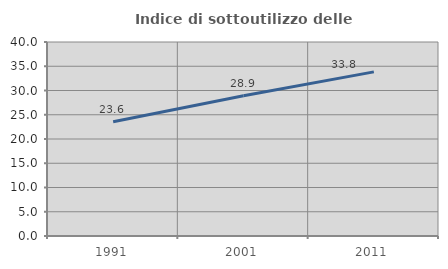
| Category | Indice di sottoutilizzo delle abitazioni  |
|---|---|
| 1991.0 | 23.573 |
| 2001.0 | 28.913 |
| 2011.0 | 33.844 |